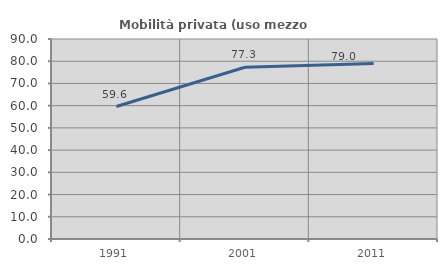
| Category | Mobilità privata (uso mezzo privato) |
|---|---|
| 1991.0 | 59.605 |
| 2001.0 | 77.288 |
| 2011.0 | 78.975 |